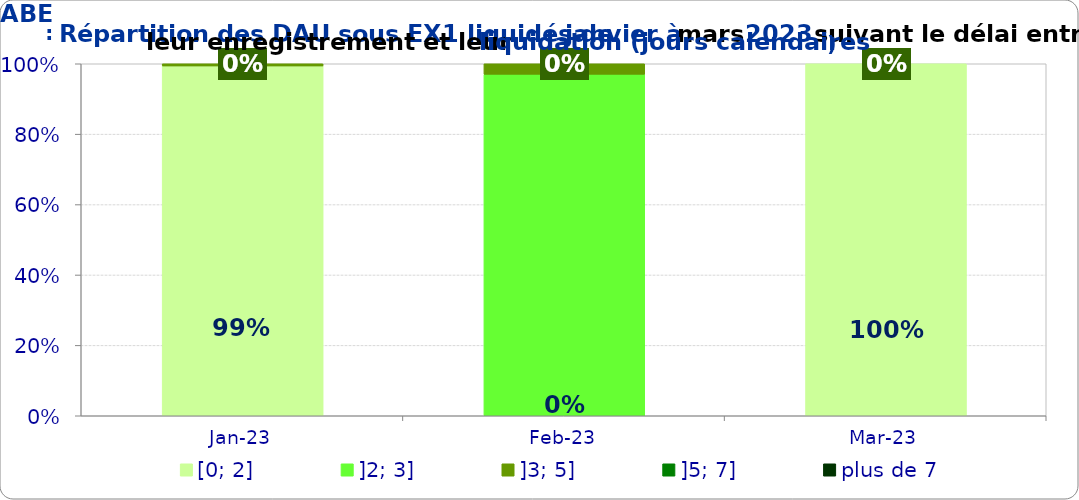
| Category | [0; 2] | ]2; 3] | ]3; 5] | ]5; 7] | plus de 7 |
|---|---|---|---|---|---|
| 2023-01-01 | 0.994 | 0 | 0.006 | 0 | 0 |
| 2023-02-01 | 0 | 0.97 | 0.03 | 0 | 0 |
| 2023-03-01 | 1 | 0 | 0 | 0 | 0 |